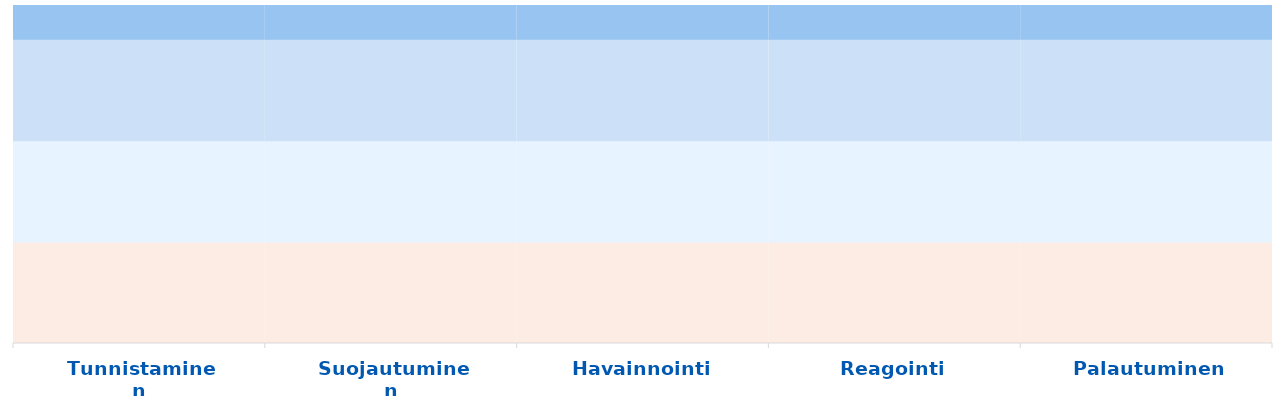
| Category | MIL0 | MIL1 | MIl2 | MIL3 |
|---|---|---|---|---|
| Tunnistaminen | 0.3 | 0.3 | 0.3 | 0.1 |
| Suojautuminen | 0.3 | 0.3 | 0.3 | 0.1 |
| Havainnointi | 0.3 | 0.3 | 0.3 | 0.1 |
| Reagointi | 0.3 | 0.3 | 0.3 | 0.1 |
| Palautuminen | 0.3 | 0.3 | 0.3 | 0.1 |